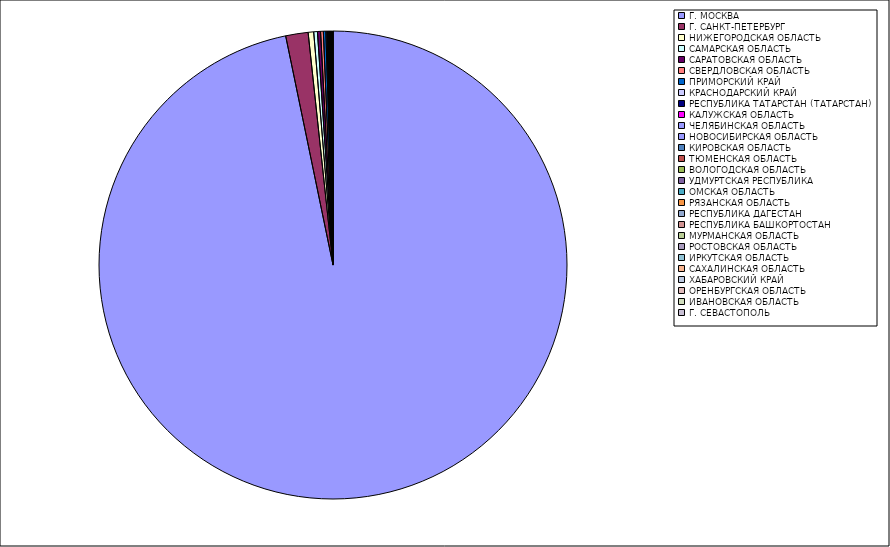
| Category | Оборот |
|---|---|
| Г. МОСКВА | 96.7 |
| Г. САНКТ-ПЕТЕРБУРГ | 1.546 |
| НИЖЕГОРОДСКАЯ ОБЛАСТЬ | 0.381 |
| САМАРСКАЯ ОБЛАСТЬ | 0.255 |
| САРАТОВСКАЯ ОБЛАСТЬ | 0.214 |
| СВЕРДЛОВСКАЯ ОБЛАСТЬ | 0.188 |
| ПРИМОРСКИЙ КРАЙ | 0.171 |
| КРАСНОДАРСКИЙ КРАЙ | 0.065 |
| РЕСПУБЛИКА ТАТАРСТАН (ТАТАРСТАН) | 0.052 |
| КАЛУЖСКАЯ ОБЛАСТЬ | 0.046 |
| ЧЕЛЯБИНСКАЯ ОБЛАСТЬ | 0.045 |
| НОВОСИБИРСКАЯ ОБЛАСТЬ | 0.04 |
| КИРОВСКАЯ ОБЛАСТЬ | 0.028 |
| ТЮМЕНСКАЯ ОБЛАСТЬ | 0.025 |
| ВОЛОГОДСКАЯ ОБЛАСТЬ | 0.024 |
| УДМУРТСКАЯ РЕСПУБЛИКА | 0.019 |
| ОМСКАЯ ОБЛАСТЬ | 0.018 |
| РЯЗАНСКАЯ ОБЛАСТЬ | 0.017 |
| РЕСПУБЛИКА ДАГЕСТАН | 0.015 |
| РЕСПУБЛИКА БАШКОРТОСТАН | 0.014 |
| МУРМАНСКАЯ ОБЛАСТЬ | 0.013 |
| РОСТОВСКАЯ ОБЛАСТЬ | 0.013 |
| ИРКУТСКАЯ ОБЛАСТЬ | 0.011 |
| САХАЛИНСКАЯ ОБЛАСТЬ | 0.01 |
| ХАБАРОВСКИЙ КРАЙ | 0.01 |
| ОРЕНБУРГСКАЯ ОБЛАСТЬ | 0.008 |
| ИВАНОВСКАЯ ОБЛАСТЬ | 0.008 |
| Г. СЕВАСТОПОЛЬ | 0.007 |